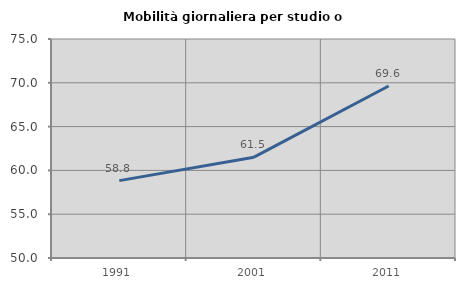
| Category | Mobilità giornaliera per studio o lavoro |
|---|---|
| 1991.0 | 58.835 |
| 2001.0 | 61.507 |
| 2011.0 | 69.636 |